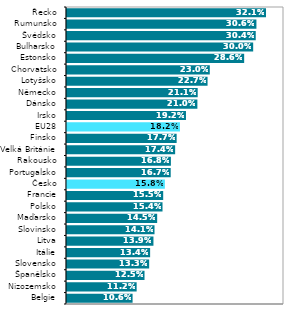
| Category | Series 0 |
|---|---|
| Belgie | 0.106 |
| Nizozemsko | 0.112 |
| Španělsko | 0.125 |
| Slovensko | 0.133 |
| Itálie | 0.134 |
| Litva | 0.139 |
| Slovinsko | 0.141 |
| Maďarsko | 0.145 |
| Polsko | 0.154 |
| Francie | 0.155 |
| Česko | 0.158 |
| Portugalsko | 0.167 |
| Rakousko | 0.168 |
| Velká Británie | 0.174 |
| Finsko | 0.177 |
| EU28 | 0.182 |
| Irsko | 0.192 |
| Dánsko | 0.21 |
| Německo | 0.211 |
| Lotyšsko | 0.227 |
| Chorvatsko | 0.23 |
| Estonsko | 0.286 |
| Bulharsko | 0.3 |
| Švédsko | 0.304 |
| Rumunsko | 0.306 |
| Řecko | 0.321 |